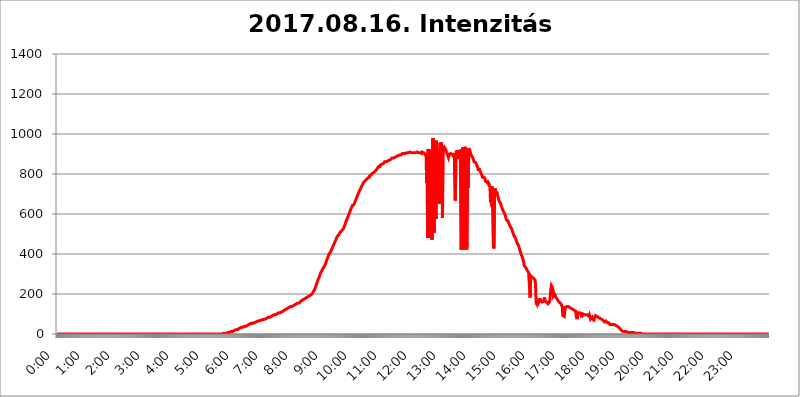
| Category | 2017.08.16. Intenzitás [W/m^2] |
|---|---|
| 0.0 | 0 |
| 0.0006944444444444445 | 0 |
| 0.001388888888888889 | 0 |
| 0.0020833333333333333 | 0 |
| 0.002777777777777778 | 0 |
| 0.003472222222222222 | 0 |
| 0.004166666666666667 | 0 |
| 0.004861111111111111 | 0 |
| 0.005555555555555556 | 0 |
| 0.0062499999999999995 | 0 |
| 0.006944444444444444 | 0 |
| 0.007638888888888889 | 0 |
| 0.008333333333333333 | 0 |
| 0.009027777777777779 | 0 |
| 0.009722222222222222 | 0 |
| 0.010416666666666666 | 0 |
| 0.011111111111111112 | 0 |
| 0.011805555555555555 | 0 |
| 0.012499999999999999 | 0 |
| 0.013194444444444444 | 0 |
| 0.013888888888888888 | 0 |
| 0.014583333333333332 | 0 |
| 0.015277777777777777 | 0 |
| 0.015972222222222224 | 0 |
| 0.016666666666666666 | 0 |
| 0.017361111111111112 | 0 |
| 0.018055555555555557 | 0 |
| 0.01875 | 0 |
| 0.019444444444444445 | 0 |
| 0.02013888888888889 | 0 |
| 0.020833333333333332 | 0 |
| 0.02152777777777778 | 0 |
| 0.022222222222222223 | 0 |
| 0.02291666666666667 | 0 |
| 0.02361111111111111 | 0 |
| 0.024305555555555556 | 0 |
| 0.024999999999999998 | 0 |
| 0.025694444444444447 | 0 |
| 0.02638888888888889 | 0 |
| 0.027083333333333334 | 0 |
| 0.027777777777777776 | 0 |
| 0.02847222222222222 | 0 |
| 0.029166666666666664 | 0 |
| 0.029861111111111113 | 0 |
| 0.030555555555555555 | 0 |
| 0.03125 | 0 |
| 0.03194444444444445 | 0 |
| 0.03263888888888889 | 0 |
| 0.03333333333333333 | 0 |
| 0.034027777777777775 | 0 |
| 0.034722222222222224 | 0 |
| 0.035416666666666666 | 0 |
| 0.036111111111111115 | 0 |
| 0.03680555555555556 | 0 |
| 0.0375 | 0 |
| 0.03819444444444444 | 0 |
| 0.03888888888888889 | 0 |
| 0.03958333333333333 | 0 |
| 0.04027777777777778 | 0 |
| 0.04097222222222222 | 0 |
| 0.041666666666666664 | 0 |
| 0.042361111111111106 | 0 |
| 0.04305555555555556 | 0 |
| 0.043750000000000004 | 0 |
| 0.044444444444444446 | 0 |
| 0.04513888888888889 | 0 |
| 0.04583333333333334 | 0 |
| 0.04652777777777778 | 0 |
| 0.04722222222222222 | 0 |
| 0.04791666666666666 | 0 |
| 0.04861111111111111 | 0 |
| 0.049305555555555554 | 0 |
| 0.049999999999999996 | 0 |
| 0.05069444444444445 | 0 |
| 0.051388888888888894 | 0 |
| 0.052083333333333336 | 0 |
| 0.05277777777777778 | 0 |
| 0.05347222222222222 | 0 |
| 0.05416666666666667 | 0 |
| 0.05486111111111111 | 0 |
| 0.05555555555555555 | 0 |
| 0.05625 | 0 |
| 0.05694444444444444 | 0 |
| 0.057638888888888885 | 0 |
| 0.05833333333333333 | 0 |
| 0.05902777777777778 | 0 |
| 0.059722222222222225 | 0 |
| 0.06041666666666667 | 0 |
| 0.061111111111111116 | 0 |
| 0.06180555555555556 | 0 |
| 0.0625 | 0 |
| 0.06319444444444444 | 0 |
| 0.06388888888888888 | 0 |
| 0.06458333333333334 | 0 |
| 0.06527777777777778 | 0 |
| 0.06597222222222222 | 0 |
| 0.06666666666666667 | 0 |
| 0.06736111111111111 | 0 |
| 0.06805555555555555 | 0 |
| 0.06874999999999999 | 0 |
| 0.06944444444444443 | 0 |
| 0.07013888888888889 | 0 |
| 0.07083333333333333 | 0 |
| 0.07152777777777779 | 0 |
| 0.07222222222222223 | 0 |
| 0.07291666666666667 | 0 |
| 0.07361111111111111 | 0 |
| 0.07430555555555556 | 0 |
| 0.075 | 0 |
| 0.07569444444444444 | 0 |
| 0.0763888888888889 | 0 |
| 0.07708333333333334 | 0 |
| 0.07777777777777778 | 0 |
| 0.07847222222222222 | 0 |
| 0.07916666666666666 | 0 |
| 0.0798611111111111 | 0 |
| 0.08055555555555556 | 0 |
| 0.08125 | 0 |
| 0.08194444444444444 | 0 |
| 0.08263888888888889 | 0 |
| 0.08333333333333333 | 0 |
| 0.08402777777777777 | 0 |
| 0.08472222222222221 | 0 |
| 0.08541666666666665 | 0 |
| 0.08611111111111112 | 0 |
| 0.08680555555555557 | 0 |
| 0.08750000000000001 | 0 |
| 0.08819444444444445 | 0 |
| 0.08888888888888889 | 0 |
| 0.08958333333333333 | 0 |
| 0.09027777777777778 | 0 |
| 0.09097222222222222 | 0 |
| 0.09166666666666667 | 0 |
| 0.09236111111111112 | 0 |
| 0.09305555555555556 | 0 |
| 0.09375 | 0 |
| 0.09444444444444444 | 0 |
| 0.09513888888888888 | 0 |
| 0.09583333333333333 | 0 |
| 0.09652777777777777 | 0 |
| 0.09722222222222222 | 0 |
| 0.09791666666666667 | 0 |
| 0.09861111111111111 | 0 |
| 0.09930555555555555 | 0 |
| 0.09999999999999999 | 0 |
| 0.10069444444444443 | 0 |
| 0.1013888888888889 | 0 |
| 0.10208333333333335 | 0 |
| 0.10277777777777779 | 0 |
| 0.10347222222222223 | 0 |
| 0.10416666666666667 | 0 |
| 0.10486111111111111 | 0 |
| 0.10555555555555556 | 0 |
| 0.10625 | 0 |
| 0.10694444444444444 | 0 |
| 0.1076388888888889 | 0 |
| 0.10833333333333334 | 0 |
| 0.10902777777777778 | 0 |
| 0.10972222222222222 | 0 |
| 0.1111111111111111 | 0 |
| 0.11180555555555556 | 0 |
| 0.11180555555555556 | 0 |
| 0.1125 | 0 |
| 0.11319444444444444 | 0 |
| 0.11388888888888889 | 0 |
| 0.11458333333333333 | 0 |
| 0.11527777777777777 | 0 |
| 0.11597222222222221 | 0 |
| 0.11666666666666665 | 0 |
| 0.1173611111111111 | 0 |
| 0.11805555555555557 | 0 |
| 0.11944444444444445 | 0 |
| 0.12013888888888889 | 0 |
| 0.12083333333333333 | 0 |
| 0.12152777777777778 | 0 |
| 0.12222222222222223 | 0 |
| 0.12291666666666667 | 0 |
| 0.12291666666666667 | 0 |
| 0.12361111111111112 | 0 |
| 0.12430555555555556 | 0 |
| 0.125 | 0 |
| 0.12569444444444444 | 0 |
| 0.12638888888888888 | 0 |
| 0.12708333333333333 | 0 |
| 0.16875 | 0 |
| 0.12847222222222224 | 0 |
| 0.12916666666666668 | 0 |
| 0.12986111111111112 | 0 |
| 0.13055555555555556 | 0 |
| 0.13125 | 0 |
| 0.13194444444444445 | 0 |
| 0.1326388888888889 | 0 |
| 0.13333333333333333 | 0 |
| 0.13402777777777777 | 0 |
| 0.13402777777777777 | 0 |
| 0.13472222222222222 | 0 |
| 0.13541666666666666 | 0 |
| 0.1361111111111111 | 0 |
| 0.13749999999999998 | 0 |
| 0.13819444444444443 | 0 |
| 0.1388888888888889 | 0 |
| 0.13958333333333334 | 0 |
| 0.14027777777777778 | 0 |
| 0.14097222222222222 | 0 |
| 0.14166666666666666 | 0 |
| 0.1423611111111111 | 0 |
| 0.14305555555555557 | 0 |
| 0.14375000000000002 | 0 |
| 0.14444444444444446 | 0 |
| 0.1451388888888889 | 0 |
| 0.1451388888888889 | 0 |
| 0.14652777777777778 | 0 |
| 0.14722222222222223 | 0 |
| 0.14791666666666667 | 0 |
| 0.1486111111111111 | 0 |
| 0.14930555555555555 | 0 |
| 0.15 | 0 |
| 0.15069444444444444 | 0 |
| 0.15138888888888888 | 0 |
| 0.15208333333333332 | 0 |
| 0.15277777777777776 | 0 |
| 0.15347222222222223 | 0 |
| 0.15416666666666667 | 0 |
| 0.15486111111111112 | 0 |
| 0.15555555555555556 | 0 |
| 0.15625 | 0 |
| 0.15694444444444444 | 0 |
| 0.15763888888888888 | 0 |
| 0.15833333333333333 | 0 |
| 0.15902777777777777 | 0 |
| 0.15972222222222224 | 0 |
| 0.16041666666666668 | 0 |
| 0.16111111111111112 | 0 |
| 0.16180555555555556 | 0 |
| 0.1625 | 0 |
| 0.16319444444444445 | 0 |
| 0.1638888888888889 | 0 |
| 0.16458333333333333 | 0 |
| 0.16527777777777777 | 0 |
| 0.16597222222222222 | 0 |
| 0.16666666666666666 | 0 |
| 0.1673611111111111 | 0 |
| 0.16805555555555554 | 0 |
| 0.16874999999999998 | 0 |
| 0.16944444444444443 | 0 |
| 0.17013888888888887 | 0 |
| 0.1708333333333333 | 0 |
| 0.17152777777777775 | 0 |
| 0.17222222222222225 | 0 |
| 0.1729166666666667 | 0 |
| 0.17361111111111113 | 0 |
| 0.17430555555555557 | 0 |
| 0.17500000000000002 | 0 |
| 0.17569444444444446 | 0 |
| 0.1763888888888889 | 0 |
| 0.17708333333333334 | 0 |
| 0.17777777777777778 | 0 |
| 0.17847222222222223 | 0 |
| 0.17916666666666667 | 0 |
| 0.1798611111111111 | 0 |
| 0.18055555555555555 | 0 |
| 0.18125 | 0 |
| 0.18194444444444444 | 0 |
| 0.1826388888888889 | 0 |
| 0.18333333333333335 | 0 |
| 0.1840277777777778 | 0 |
| 0.18472222222222223 | 0 |
| 0.18541666666666667 | 0 |
| 0.18611111111111112 | 0 |
| 0.18680555555555556 | 0 |
| 0.1875 | 0 |
| 0.18819444444444444 | 0 |
| 0.18888888888888888 | 0 |
| 0.18958333333333333 | 0 |
| 0.19027777777777777 | 0 |
| 0.1909722222222222 | 0 |
| 0.19166666666666665 | 0 |
| 0.19236111111111112 | 0 |
| 0.19305555555555554 | 0 |
| 0.19375 | 0 |
| 0.19444444444444445 | 0 |
| 0.1951388888888889 | 0 |
| 0.19583333333333333 | 0 |
| 0.19652777777777777 | 0 |
| 0.19722222222222222 | 0 |
| 0.19791666666666666 | 0 |
| 0.1986111111111111 | 0 |
| 0.19930555555555554 | 0 |
| 0.19999999999999998 | 0 |
| 0.20069444444444443 | 0 |
| 0.20138888888888887 | 0 |
| 0.2020833333333333 | 0 |
| 0.2027777777777778 | 0 |
| 0.2034722222222222 | 0 |
| 0.2041666666666667 | 0 |
| 0.20486111111111113 | 0 |
| 0.20555555555555557 | 0 |
| 0.20625000000000002 | 0 |
| 0.20694444444444446 | 0 |
| 0.2076388888888889 | 0 |
| 0.20833333333333334 | 0 |
| 0.20902777777777778 | 0 |
| 0.20972222222222223 | 0 |
| 0.21041666666666667 | 0 |
| 0.2111111111111111 | 0 |
| 0.21180555555555555 | 0 |
| 0.2125 | 0 |
| 0.21319444444444444 | 0 |
| 0.2138888888888889 | 0 |
| 0.21458333333333335 | 0 |
| 0.2152777777777778 | 0 |
| 0.21597222222222223 | 0 |
| 0.21666666666666667 | 0 |
| 0.21736111111111112 | 0 |
| 0.21805555555555556 | 0 |
| 0.21875 | 0 |
| 0.21944444444444444 | 0 |
| 0.22013888888888888 | 0 |
| 0.22083333333333333 | 0 |
| 0.22152777777777777 | 0 |
| 0.2222222222222222 | 0 |
| 0.22291666666666665 | 0 |
| 0.2236111111111111 | 0 |
| 0.22430555555555556 | 0 |
| 0.225 | 0 |
| 0.22569444444444445 | 0 |
| 0.2263888888888889 | 0 |
| 0.22708333333333333 | 0 |
| 0.22777777777777777 | 0 |
| 0.22847222222222222 | 0 |
| 0.22916666666666666 | 0 |
| 0.2298611111111111 | 0 |
| 0.23055555555555554 | 0 |
| 0.23124999999999998 | 0 |
| 0.23194444444444443 | 0 |
| 0.23263888888888887 | 0 |
| 0.2333333333333333 | 3.525 |
| 0.2340277777777778 | 3.525 |
| 0.2347222222222222 | 3.525 |
| 0.2354166666666667 | 3.525 |
| 0.23611111111111113 | 3.525 |
| 0.23680555555555557 | 3.525 |
| 0.23750000000000002 | 3.525 |
| 0.23819444444444446 | 3.525 |
| 0.2388888888888889 | 3.525 |
| 0.23958333333333334 | 7.887 |
| 0.24027777777777778 | 7.887 |
| 0.24097222222222223 | 7.887 |
| 0.24166666666666667 | 7.887 |
| 0.2423611111111111 | 12.257 |
| 0.24305555555555555 | 12.257 |
| 0.24375 | 12.257 |
| 0.24444444444444446 | 12.257 |
| 0.24513888888888888 | 12.257 |
| 0.24583333333333335 | 12.257 |
| 0.2465277777777778 | 16.636 |
| 0.24722222222222223 | 16.636 |
| 0.24791666666666667 | 16.636 |
| 0.24861111111111112 | 16.636 |
| 0.24930555555555556 | 21.024 |
| 0.25 | 21.024 |
| 0.25069444444444444 | 21.024 |
| 0.2513888888888889 | 21.024 |
| 0.2520833333333333 | 21.024 |
| 0.25277777777777777 | 25.419 |
| 0.2534722222222222 | 25.419 |
| 0.25416666666666665 | 25.419 |
| 0.2548611111111111 | 25.419 |
| 0.2555555555555556 | 29.823 |
| 0.25625000000000003 | 29.823 |
| 0.2569444444444445 | 29.823 |
| 0.2576388888888889 | 29.823 |
| 0.25833333333333336 | 34.234 |
| 0.2590277777777778 | 34.234 |
| 0.25972222222222224 | 34.234 |
| 0.2604166666666667 | 34.234 |
| 0.2611111111111111 | 38.653 |
| 0.26180555555555557 | 38.653 |
| 0.2625 | 38.653 |
| 0.26319444444444445 | 38.653 |
| 0.2638888888888889 | 38.653 |
| 0.26458333333333334 | 38.653 |
| 0.2652777777777778 | 43.079 |
| 0.2659722222222222 | 43.079 |
| 0.26666666666666666 | 43.079 |
| 0.2673611111111111 | 43.079 |
| 0.26805555555555555 | 47.511 |
| 0.26875 | 47.511 |
| 0.26944444444444443 | 47.511 |
| 0.2701388888888889 | 47.511 |
| 0.2708333333333333 | 51.951 |
| 0.27152777777777776 | 51.951 |
| 0.2722222222222222 | 51.951 |
| 0.27291666666666664 | 51.951 |
| 0.2736111111111111 | 51.951 |
| 0.2743055555555555 | 56.398 |
| 0.27499999999999997 | 56.398 |
| 0.27569444444444446 | 56.398 |
| 0.27638888888888885 | 56.398 |
| 0.27708333333333335 | 56.398 |
| 0.2777777777777778 | 56.398 |
| 0.27847222222222223 | 60.85 |
| 0.2791666666666667 | 60.85 |
| 0.2798611111111111 | 60.85 |
| 0.28055555555555556 | 60.85 |
| 0.28125 | 65.31 |
| 0.28194444444444444 | 65.31 |
| 0.2826388888888889 | 65.31 |
| 0.2833333333333333 | 65.31 |
| 0.28402777777777777 | 65.31 |
| 0.2847222222222222 | 65.31 |
| 0.28541666666666665 | 69.775 |
| 0.28611111111111115 | 69.775 |
| 0.28680555555555554 | 69.775 |
| 0.28750000000000003 | 69.775 |
| 0.2881944444444445 | 69.775 |
| 0.2888888888888889 | 74.246 |
| 0.28958333333333336 | 74.246 |
| 0.2902777777777778 | 74.246 |
| 0.29097222222222224 | 74.246 |
| 0.2916666666666667 | 74.246 |
| 0.2923611111111111 | 78.722 |
| 0.29305555555555557 | 78.722 |
| 0.29375 | 78.722 |
| 0.29444444444444445 | 78.722 |
| 0.2951388888888889 | 83.205 |
| 0.29583333333333334 | 83.205 |
| 0.2965277777777778 | 83.205 |
| 0.2972222222222222 | 83.205 |
| 0.29791666666666666 | 83.205 |
| 0.2986111111111111 | 87.692 |
| 0.29930555555555555 | 87.692 |
| 0.3 | 87.692 |
| 0.30069444444444443 | 87.692 |
| 0.3013888888888889 | 92.184 |
| 0.3020833333333333 | 92.184 |
| 0.30277777777777776 | 92.184 |
| 0.3034722222222222 | 92.184 |
| 0.30416666666666664 | 96.682 |
| 0.3048611111111111 | 96.682 |
| 0.3055555555555555 | 96.682 |
| 0.30624999999999997 | 96.682 |
| 0.3069444444444444 | 101.184 |
| 0.3076388888888889 | 101.184 |
| 0.30833333333333335 | 101.184 |
| 0.3090277777777778 | 101.184 |
| 0.30972222222222223 | 105.69 |
| 0.3104166666666667 | 105.69 |
| 0.3111111111111111 | 105.69 |
| 0.31180555555555556 | 105.69 |
| 0.3125 | 105.69 |
| 0.31319444444444444 | 110.201 |
| 0.3138888888888889 | 110.201 |
| 0.3145833333333333 | 110.201 |
| 0.31527777777777777 | 110.201 |
| 0.3159722222222222 | 114.716 |
| 0.31666666666666665 | 114.716 |
| 0.31736111111111115 | 114.716 |
| 0.31805555555555554 | 119.235 |
| 0.31875000000000003 | 119.235 |
| 0.3194444444444445 | 119.235 |
| 0.3201388888888889 | 119.235 |
| 0.32083333333333336 | 123.758 |
| 0.3215277777777778 | 123.758 |
| 0.32222222222222224 | 123.758 |
| 0.3229166666666667 | 128.284 |
| 0.3236111111111111 | 128.284 |
| 0.32430555555555557 | 128.284 |
| 0.325 | 132.814 |
| 0.32569444444444445 | 132.814 |
| 0.3263888888888889 | 132.814 |
| 0.32708333333333334 | 137.347 |
| 0.3277777777777778 | 137.347 |
| 0.3284722222222222 | 137.347 |
| 0.32916666666666666 | 137.347 |
| 0.3298611111111111 | 137.347 |
| 0.33055555555555555 | 141.884 |
| 0.33125 | 141.884 |
| 0.33194444444444443 | 146.423 |
| 0.3326388888888889 | 146.423 |
| 0.3333333333333333 | 146.423 |
| 0.3340277777777778 | 146.423 |
| 0.3347222222222222 | 150.964 |
| 0.3354166666666667 | 150.964 |
| 0.3361111111111111 | 150.964 |
| 0.3368055555555556 | 150.964 |
| 0.33749999999999997 | 155.509 |
| 0.33819444444444446 | 155.509 |
| 0.33888888888888885 | 155.509 |
| 0.33958333333333335 | 155.509 |
| 0.34027777777777773 | 160.056 |
| 0.34097222222222223 | 160.056 |
| 0.3416666666666666 | 164.605 |
| 0.3423611111111111 | 164.605 |
| 0.3430555555555555 | 164.605 |
| 0.34375 | 169.156 |
| 0.3444444444444445 | 169.156 |
| 0.3451388888888889 | 169.156 |
| 0.3458333333333334 | 173.709 |
| 0.34652777777777777 | 173.709 |
| 0.34722222222222227 | 173.709 |
| 0.34791666666666665 | 178.264 |
| 0.34861111111111115 | 178.264 |
| 0.34930555555555554 | 182.82 |
| 0.35000000000000003 | 182.82 |
| 0.3506944444444444 | 182.82 |
| 0.3513888888888889 | 182.82 |
| 0.3520833333333333 | 187.378 |
| 0.3527777777777778 | 187.378 |
| 0.3534722222222222 | 191.937 |
| 0.3541666666666667 | 191.937 |
| 0.3548611111111111 | 191.937 |
| 0.35555555555555557 | 191.937 |
| 0.35625 | 196.497 |
| 0.35694444444444445 | 196.497 |
| 0.3576388888888889 | 201.058 |
| 0.35833333333333334 | 205.62 |
| 0.3590277777777778 | 210.182 |
| 0.3597222222222222 | 214.746 |
| 0.36041666666666666 | 219.309 |
| 0.3611111111111111 | 223.873 |
| 0.36180555555555555 | 228.436 |
| 0.3625 | 237.564 |
| 0.36319444444444443 | 242.127 |
| 0.3638888888888889 | 251.251 |
| 0.3645833333333333 | 260.373 |
| 0.3652777777777778 | 264.932 |
| 0.3659722222222222 | 274.047 |
| 0.3666666666666667 | 278.603 |
| 0.3673611111111111 | 283.156 |
| 0.3680555555555556 | 292.259 |
| 0.36874999999999997 | 296.808 |
| 0.36944444444444446 | 305.898 |
| 0.37013888888888885 | 310.44 |
| 0.37083333333333335 | 314.98 |
| 0.37152777777777773 | 319.517 |
| 0.37222222222222223 | 324.052 |
| 0.3729166666666666 | 328.584 |
| 0.3736111111111111 | 333.113 |
| 0.3743055555555555 | 337.639 |
| 0.375 | 342.162 |
| 0.3756944444444445 | 346.682 |
| 0.3763888888888889 | 351.198 |
| 0.3770833333333334 | 360.221 |
| 0.37777777777777777 | 364.728 |
| 0.37847222222222227 | 373.729 |
| 0.37916666666666665 | 378.224 |
| 0.37986111111111115 | 387.202 |
| 0.38055555555555554 | 391.685 |
| 0.38125000000000003 | 400.638 |
| 0.3819444444444444 | 400.638 |
| 0.3826388888888889 | 405.108 |
| 0.3833333333333333 | 409.574 |
| 0.3840277777777778 | 414.035 |
| 0.3847222222222222 | 422.943 |
| 0.3854166666666667 | 427.39 |
| 0.3861111111111111 | 431.833 |
| 0.38680555555555557 | 440.702 |
| 0.3875 | 445.129 |
| 0.38819444444444445 | 449.551 |
| 0.3888888888888889 | 453.968 |
| 0.38958333333333334 | 462.786 |
| 0.3902777777777778 | 467.187 |
| 0.3909722222222222 | 471.582 |
| 0.39166666666666666 | 480.356 |
| 0.3923611111111111 | 484.735 |
| 0.39305555555555555 | 489.108 |
| 0.39375 | 489.108 |
| 0.39444444444444443 | 493.475 |
| 0.3951388888888889 | 497.836 |
| 0.3958333333333333 | 502.192 |
| 0.3965277777777778 | 506.542 |
| 0.3972222222222222 | 506.542 |
| 0.3979166666666667 | 510.885 |
| 0.3986111111111111 | 515.223 |
| 0.3993055555555556 | 519.555 |
| 0.39999999999999997 | 519.555 |
| 0.40069444444444446 | 523.88 |
| 0.40138888888888885 | 528.2 |
| 0.40208333333333335 | 532.513 |
| 0.40277777777777773 | 536.82 |
| 0.40347222222222223 | 545.416 |
| 0.4041666666666666 | 553.986 |
| 0.4048611111111111 | 558.261 |
| 0.4055555555555555 | 566.793 |
| 0.40625 | 571.049 |
| 0.4069444444444445 | 579.542 |
| 0.4076388888888889 | 583.779 |
| 0.4083333333333334 | 592.233 |
| 0.40902777777777777 | 596.45 |
| 0.40972222222222227 | 604.864 |
| 0.41041666666666665 | 609.062 |
| 0.41111111111111115 | 617.436 |
| 0.41180555555555554 | 625.784 |
| 0.41250000000000003 | 629.948 |
| 0.4131944444444444 | 634.105 |
| 0.4138888888888889 | 642.4 |
| 0.4145833333333333 | 642.4 |
| 0.4152777777777778 | 646.537 |
| 0.4159722222222222 | 646.537 |
| 0.4166666666666667 | 650.667 |
| 0.4173611111111111 | 658.909 |
| 0.41805555555555557 | 663.019 |
| 0.41875 | 671.22 |
| 0.41944444444444445 | 675.311 |
| 0.4201388888888889 | 683.473 |
| 0.42083333333333334 | 687.544 |
| 0.4215277777777778 | 695.666 |
| 0.4222222222222222 | 699.717 |
| 0.42291666666666666 | 707.8 |
| 0.4236111111111111 | 711.832 |
| 0.42430555555555555 | 719.877 |
| 0.425 | 723.889 |
| 0.42569444444444443 | 727.896 |
| 0.4263888888888889 | 735.89 |
| 0.4270833333333333 | 739.877 |
| 0.4277777777777778 | 743.859 |
| 0.4284722222222222 | 747.834 |
| 0.4291666666666667 | 755.766 |
| 0.4298611111111111 | 755.766 |
| 0.4305555555555556 | 759.723 |
| 0.43124999999999997 | 763.674 |
| 0.43194444444444446 | 767.62 |
| 0.43263888888888885 | 767.62 |
| 0.43333333333333335 | 771.559 |
| 0.43402777777777773 | 775.492 |
| 0.43472222222222223 | 775.492 |
| 0.4354166666666666 | 779.42 |
| 0.4361111111111111 | 783.342 |
| 0.4368055555555555 | 783.342 |
| 0.4375 | 783.342 |
| 0.4381944444444445 | 791.169 |
| 0.4388888888888889 | 791.169 |
| 0.4395833333333334 | 791.169 |
| 0.44027777777777777 | 795.074 |
| 0.44097222222222227 | 798.974 |
| 0.44166666666666665 | 802.868 |
| 0.44236111111111115 | 802.868 |
| 0.44305555555555554 | 802.868 |
| 0.44375000000000003 | 806.757 |
| 0.4444444444444444 | 810.641 |
| 0.4451388888888889 | 810.641 |
| 0.4458333333333333 | 814.519 |
| 0.4465277777777778 | 814.519 |
| 0.4472222222222222 | 818.392 |
| 0.4479166666666667 | 822.26 |
| 0.4486111111111111 | 822.26 |
| 0.44930555555555557 | 829.981 |
| 0.45 | 829.981 |
| 0.45069444444444445 | 837.682 |
| 0.4513888888888889 | 837.682 |
| 0.45208333333333334 | 837.682 |
| 0.4527777777777778 | 837.682 |
| 0.4534722222222222 | 845.365 |
| 0.45416666666666666 | 845.365 |
| 0.4548611111111111 | 849.199 |
| 0.45555555555555555 | 849.199 |
| 0.45625 | 853.029 |
| 0.45694444444444443 | 849.199 |
| 0.4576388888888889 | 853.029 |
| 0.4583333333333333 | 856.855 |
| 0.4590277777777778 | 860.676 |
| 0.4597222222222222 | 860.676 |
| 0.4604166666666667 | 860.676 |
| 0.4611111111111111 | 860.676 |
| 0.4618055555555556 | 860.676 |
| 0.46249999999999997 | 860.676 |
| 0.46319444444444446 | 864.493 |
| 0.46388888888888885 | 868.305 |
| 0.46458333333333335 | 864.493 |
| 0.46527777777777773 | 868.305 |
| 0.46597222222222223 | 868.305 |
| 0.4666666666666666 | 868.305 |
| 0.4673611111111111 | 872.114 |
| 0.4680555555555555 | 868.305 |
| 0.46875 | 872.114 |
| 0.4694444444444445 | 879.719 |
| 0.4701388888888889 | 879.719 |
| 0.4708333333333334 | 879.719 |
| 0.47152777777777777 | 879.719 |
| 0.47222222222222227 | 883.516 |
| 0.47291666666666665 | 883.516 |
| 0.47361111111111115 | 883.516 |
| 0.47430555555555554 | 883.516 |
| 0.47500000000000003 | 887.309 |
| 0.4756944444444444 | 887.309 |
| 0.4763888888888889 | 887.309 |
| 0.4770833333333333 | 891.099 |
| 0.4777777777777778 | 891.099 |
| 0.4784722222222222 | 891.099 |
| 0.4791666666666667 | 894.885 |
| 0.4798611111111111 | 894.885 |
| 0.48055555555555557 | 894.885 |
| 0.48125 | 894.885 |
| 0.48194444444444445 | 894.885 |
| 0.4826388888888889 | 894.885 |
| 0.48333333333333334 | 898.668 |
| 0.4840277777777778 | 902.447 |
| 0.4847222222222222 | 902.447 |
| 0.48541666666666666 | 902.447 |
| 0.4861111111111111 | 902.447 |
| 0.48680555555555555 | 902.447 |
| 0.4875 | 902.447 |
| 0.48819444444444443 | 902.447 |
| 0.4888888888888889 | 906.223 |
| 0.4895833333333333 | 906.223 |
| 0.4902777777777778 | 906.223 |
| 0.4909722222222222 | 906.223 |
| 0.4916666666666667 | 906.223 |
| 0.4923611111111111 | 906.223 |
| 0.4930555555555556 | 906.223 |
| 0.49374999999999997 | 906.223 |
| 0.49444444444444446 | 909.996 |
| 0.49513888888888885 | 909.996 |
| 0.49583333333333335 | 906.223 |
| 0.49652777777777773 | 906.223 |
| 0.49722222222222223 | 909.996 |
| 0.4979166666666666 | 906.223 |
| 0.4986111111111111 | 906.223 |
| 0.4993055555555555 | 909.996 |
| 0.5 | 906.223 |
| 0.5006944444444444 | 906.223 |
| 0.5013888888888889 | 909.996 |
| 0.5020833333333333 | 909.996 |
| 0.5027777777777778 | 906.223 |
| 0.5034722222222222 | 909.996 |
| 0.5041666666666667 | 909.996 |
| 0.5048611111111111 | 909.996 |
| 0.5055555555555555 | 909.996 |
| 0.50625 | 909.996 |
| 0.5069444444444444 | 906.223 |
| 0.5076388888888889 | 909.996 |
| 0.5083333333333333 | 909.996 |
| 0.5090277777777777 | 906.223 |
| 0.5097222222222222 | 906.223 |
| 0.5104166666666666 | 906.223 |
| 0.5111111111111112 | 902.447 |
| 0.5118055555555555 | 909.996 |
| 0.5125000000000001 | 909.996 |
| 0.5131944444444444 | 909.996 |
| 0.513888888888889 | 906.223 |
| 0.5145833333333333 | 902.447 |
| 0.5152777777777778 | 902.447 |
| 0.5159722222222222 | 898.668 |
| 0.5166666666666667 | 894.885 |
| 0.517361111111111 | 887.309 |
| 0.5180555555555556 | 755.766 |
| 0.5187499999999999 | 902.447 |
| 0.5194444444444445 | 480.356 |
| 0.5201388888888888 | 925.06 |
| 0.5208333333333334 | 913.766 |
| 0.5215277777777778 | 894.885 |
| 0.5222222222222223 | 894.885 |
| 0.5229166666666667 | 921.298 |
| 0.5236111111111111 | 480.356 |
| 0.5243055555555556 | 502.192 |
| 0.525 | 837.682 |
| 0.5256944444444445 | 471.582 |
| 0.5263888888888889 | 977.508 |
| 0.5270833333333333 | 958.814 |
| 0.5277777777777778 | 977.508 |
| 0.5284722222222222 | 506.542 |
| 0.5291666666666667 | 791.169 |
| 0.5298611111111111 | 872.114 |
| 0.5305555555555556 | 600.661 |
| 0.53125 | 575.299 |
| 0.5319444444444444 | 966.295 |
| 0.5326388888888889 | 898.668 |
| 0.5333333333333333 | 711.832 |
| 0.5340277777777778 | 650.667 |
| 0.5347222222222222 | 909.996 |
| 0.5354166666666667 | 650.667 |
| 0.5361111111111111 | 658.909 |
| 0.5368055555555555 | 955.071 |
| 0.5375 | 947.58 |
| 0.5381944444444444 | 958.814 |
| 0.5388888888888889 | 955.071 |
| 0.5395833333333333 | 936.33 |
| 0.5402777777777777 | 579.542 |
| 0.5409722222222222 | 925.06 |
| 0.5416666666666666 | 936.33 |
| 0.5423611111111112 | 925.06 |
| 0.5430555555555555 | 932.576 |
| 0.5437500000000001 | 928.819 |
| 0.5444444444444444 | 925.06 |
| 0.545138888888889 | 917.534 |
| 0.5458333333333333 | 913.766 |
| 0.5465277777777778 | 906.223 |
| 0.5472222222222222 | 898.668 |
| 0.5479166666666667 | 898.668 |
| 0.548611111111111 | 883.516 |
| 0.5493055555555556 | 894.885 |
| 0.5499999999999999 | 898.668 |
| 0.5506944444444445 | 894.885 |
| 0.5513888888888888 | 902.447 |
| 0.5520833333333334 | 898.668 |
| 0.5527777777777778 | 902.447 |
| 0.5534722222222223 | 898.668 |
| 0.5541666666666667 | 898.668 |
| 0.5548611111111111 | 902.447 |
| 0.5555555555555556 | 898.668 |
| 0.55625 | 883.516 |
| 0.5569444444444445 | 894.885 |
| 0.5576388888888889 | 894.885 |
| 0.5583333333333333 | 667.123 |
| 0.5590277777777778 | 841.526 |
| 0.5597222222222222 | 917.534 |
| 0.5604166666666667 | 909.996 |
| 0.5611111111111111 | 917.534 |
| 0.5618055555555556 | 891.099 |
| 0.5625 | 875.918 |
| 0.5631944444444444 | 883.516 |
| 0.5638888888888889 | 913.766 |
| 0.5645833333333333 | 898.668 |
| 0.5652777777777778 | 921.298 |
| 0.5659722222222222 | 917.534 |
| 0.5666666666666667 | 422.943 |
| 0.5673611111111111 | 625.784 |
| 0.5680555555555555 | 925.06 |
| 0.56875 | 932.576 |
| 0.5694444444444444 | 536.82 |
| 0.5701388888888889 | 629.948 |
| 0.5708333333333333 | 422.943 |
| 0.5715277777777777 | 475.972 |
| 0.5722222222222222 | 936.33 |
| 0.5729166666666666 | 638.256 |
| 0.5736111111111112 | 445.129 |
| 0.5743055555555555 | 422.943 |
| 0.5750000000000001 | 453.968 |
| 0.5756944444444444 | 902.447 |
| 0.576388888888889 | 731.896 |
| 0.5770833333333333 | 928.819 |
| 0.5777777777777778 | 928.819 |
| 0.5784722222222222 | 928.819 |
| 0.5791666666666667 | 909.996 |
| 0.579861111111111 | 902.447 |
| 0.5805555555555556 | 894.885 |
| 0.5812499999999999 | 891.099 |
| 0.5819444444444445 | 887.309 |
| 0.5826388888888888 | 883.516 |
| 0.5833333333333334 | 875.918 |
| 0.5840277777777778 | 872.114 |
| 0.5847222222222223 | 860.676 |
| 0.5854166666666667 | 864.493 |
| 0.5861111111111111 | 856.855 |
| 0.5868055555555556 | 856.855 |
| 0.5875 | 853.029 |
| 0.5881944444444445 | 845.365 |
| 0.5888888888888889 | 841.526 |
| 0.5895833333333333 | 833.834 |
| 0.5902777777777778 | 822.26 |
| 0.5909722222222222 | 818.392 |
| 0.5916666666666667 | 822.26 |
| 0.5923611111111111 | 822.26 |
| 0.5930555555555556 | 814.519 |
| 0.59375 | 810.641 |
| 0.5944444444444444 | 802.868 |
| 0.5951388888888889 | 802.868 |
| 0.5958333333333333 | 791.169 |
| 0.5965277777777778 | 783.342 |
| 0.5972222222222222 | 779.42 |
| 0.5979166666666667 | 783.342 |
| 0.5986111111111111 | 783.342 |
| 0.5993055555555555 | 779.42 |
| 0.6 | 775.492 |
| 0.6006944444444444 | 763.674 |
| 0.6013888888888889 | 763.674 |
| 0.6020833333333333 | 763.674 |
| 0.6027777777777777 | 759.723 |
| 0.6034722222222222 | 767.62 |
| 0.6041666666666666 | 751.803 |
| 0.6048611111111112 | 759.723 |
| 0.6055555555555555 | 743.859 |
| 0.6062500000000001 | 743.859 |
| 0.6069444444444444 | 735.89 |
| 0.607638888888889 | 658.909 |
| 0.6083333333333333 | 735.89 |
| 0.6090277777777778 | 739.877 |
| 0.6097222222222222 | 638.256 |
| 0.6104166666666667 | 735.89 |
| 0.611111111111111 | 739.877 |
| 0.6118055555555556 | 440.702 |
| 0.6124999999999999 | 427.39 |
| 0.6131944444444445 | 671.22 |
| 0.6138888888888888 | 727.896 |
| 0.6145833333333334 | 719.877 |
| 0.6152777777777778 | 691.608 |
| 0.6159722222222223 | 711.832 |
| 0.6166666666666667 | 711.832 |
| 0.6173611111111111 | 695.666 |
| 0.6180555555555556 | 687.544 |
| 0.61875 | 675.311 |
| 0.6194444444444445 | 667.123 |
| 0.6201388888888889 | 663.019 |
| 0.6208333333333333 | 663.019 |
| 0.6215277777777778 | 654.791 |
| 0.6222222222222222 | 646.537 |
| 0.6229166666666667 | 638.256 |
| 0.6236111111111111 | 634.105 |
| 0.6243055555555556 | 625.784 |
| 0.625 | 621.613 |
| 0.6256944444444444 | 613.252 |
| 0.6263888888888889 | 609.062 |
| 0.6270833333333333 | 604.864 |
| 0.6277777777777778 | 600.661 |
| 0.6284722222222222 | 592.233 |
| 0.6291666666666667 | 588.009 |
| 0.6298611111111111 | 571.049 |
| 0.6305555555555555 | 575.299 |
| 0.63125 | 571.049 |
| 0.6319444444444444 | 566.793 |
| 0.6326388888888889 | 558.261 |
| 0.6333333333333333 | 553.986 |
| 0.6340277777777777 | 549.704 |
| 0.6347222222222222 | 541.121 |
| 0.6354166666666666 | 541.121 |
| 0.6361111111111112 | 532.513 |
| 0.6368055555555555 | 528.2 |
| 0.6375000000000001 | 523.88 |
| 0.6381944444444444 | 515.223 |
| 0.638888888888889 | 510.885 |
| 0.6395833333333333 | 502.192 |
| 0.6402777777777778 | 493.475 |
| 0.6409722222222222 | 489.108 |
| 0.6416666666666667 | 484.735 |
| 0.642361111111111 | 480.356 |
| 0.6430555555555556 | 475.972 |
| 0.6437499999999999 | 467.187 |
| 0.6444444444444445 | 462.786 |
| 0.6451388888888888 | 453.968 |
| 0.6458333333333334 | 449.551 |
| 0.6465277777777778 | 445.129 |
| 0.6472222222222223 | 440.702 |
| 0.6479166666666667 | 431.833 |
| 0.6486111111111111 | 422.943 |
| 0.6493055555555556 | 414.035 |
| 0.65 | 405.108 |
| 0.6506944444444445 | 396.164 |
| 0.6513888888888889 | 391.685 |
| 0.6520833333333333 | 387.202 |
| 0.6527777777777778 | 378.224 |
| 0.6534722222222222 | 369.23 |
| 0.6541666666666667 | 360.221 |
| 0.6548611111111111 | 342.162 |
| 0.6555555555555556 | 342.162 |
| 0.65625 | 337.639 |
| 0.6569444444444444 | 333.113 |
| 0.6576388888888889 | 328.584 |
| 0.6583333333333333 | 324.052 |
| 0.6590277777777778 | 319.517 |
| 0.6597222222222222 | 314.98 |
| 0.6604166666666667 | 310.44 |
| 0.6611111111111111 | 305.898 |
| 0.6618055555555555 | 305.898 |
| 0.6625 | 301.354 |
| 0.6631944444444444 | 182.82 |
| 0.6638888888888889 | 292.259 |
| 0.6645833333333333 | 287.709 |
| 0.6652777777777777 | 287.709 |
| 0.6659722222222222 | 283.156 |
| 0.6666666666666666 | 283.156 |
| 0.6673611111111111 | 278.603 |
| 0.6680555555555556 | 278.603 |
| 0.6687500000000001 | 278.603 |
| 0.6694444444444444 | 274.047 |
| 0.6701388888888888 | 269.49 |
| 0.6708333333333334 | 242.127 |
| 0.6715277777777778 | 160.056 |
| 0.6722222222222222 | 146.423 |
| 0.6729166666666666 | 155.509 |
| 0.6736111111111112 | 146.423 |
| 0.6743055555555556 | 146.423 |
| 0.6749999999999999 | 155.509 |
| 0.6756944444444444 | 155.509 |
| 0.6763888888888889 | 160.056 |
| 0.6770833333333334 | 178.264 |
| 0.6777777777777777 | 164.605 |
| 0.6784722222222223 | 164.605 |
| 0.6791666666666667 | 160.056 |
| 0.6798611111111111 | 160.056 |
| 0.6805555555555555 | 164.605 |
| 0.68125 | 164.605 |
| 0.6819444444444445 | 164.605 |
| 0.6826388888888889 | 169.156 |
| 0.6833333333333332 | 182.82 |
| 0.6840277777777778 | 164.605 |
| 0.6847222222222222 | 160.056 |
| 0.6854166666666667 | 160.056 |
| 0.686111111111111 | 160.056 |
| 0.6868055555555556 | 155.509 |
| 0.6875 | 155.509 |
| 0.6881944444444444 | 150.964 |
| 0.688888888888889 | 150.964 |
| 0.6895833333333333 | 155.509 |
| 0.6902777777777778 | 160.056 |
| 0.6909722222222222 | 169.156 |
| 0.6916666666666668 | 205.62 |
| 0.6923611111111111 | 201.058 |
| 0.6930555555555555 | 242.127 |
| 0.69375 | 237.564 |
| 0.6944444444444445 | 233 |
| 0.6951388888888889 | 223.873 |
| 0.6958333333333333 | 191.937 |
| 0.6965277777777777 | 187.378 |
| 0.6972222222222223 | 201.058 |
| 0.6979166666666666 | 196.497 |
| 0.6986111111111111 | 191.937 |
| 0.6993055555555556 | 182.82 |
| 0.7000000000000001 | 178.264 |
| 0.7006944444444444 | 178.264 |
| 0.7013888888888888 | 173.709 |
| 0.7020833333333334 | 173.709 |
| 0.7027777777777778 | 169.156 |
| 0.7034722222222222 | 160.056 |
| 0.7041666666666666 | 155.509 |
| 0.7048611111111112 | 155.509 |
| 0.7055555555555556 | 155.509 |
| 0.7062499999999999 | 150.964 |
| 0.7069444444444444 | 146.423 |
| 0.7076388888888889 | 146.423 |
| 0.7083333333333334 | 137.347 |
| 0.7090277777777777 | 92.184 |
| 0.7097222222222223 | 96.682 |
| 0.7104166666666667 | 92.184 |
| 0.7111111111111111 | 87.692 |
| 0.7118055555555555 | 87.692 |
| 0.7125 | 132.814 |
| 0.7131944444444445 | 137.347 |
| 0.7138888888888889 | 137.347 |
| 0.7145833333333332 | 137.347 |
| 0.7152777777777778 | 137.347 |
| 0.7159722222222222 | 137.347 |
| 0.7166666666666667 | 137.347 |
| 0.717361111111111 | 137.347 |
| 0.7180555555555556 | 137.347 |
| 0.71875 | 132.814 |
| 0.7194444444444444 | 132.814 |
| 0.720138888888889 | 128.284 |
| 0.7208333333333333 | 128.284 |
| 0.7215277777777778 | 128.284 |
| 0.7222222222222222 | 128.284 |
| 0.7229166666666668 | 123.758 |
| 0.7236111111111111 | 123.758 |
| 0.7243055555555555 | 119.235 |
| 0.725 | 119.235 |
| 0.7256944444444445 | 119.235 |
| 0.7263888888888889 | 119.235 |
| 0.7270833333333333 | 114.716 |
| 0.7277777777777777 | 92.184 |
| 0.7284722222222223 | 83.205 |
| 0.7291666666666666 | 74.246 |
| 0.7298611111111111 | 92.184 |
| 0.7305555555555556 | 105.69 |
| 0.7312500000000001 | 105.69 |
| 0.7319444444444444 | 110.201 |
| 0.7326388888888888 | 105.69 |
| 0.7333333333333334 | 105.69 |
| 0.7340277777777778 | 105.69 |
| 0.7347222222222222 | 101.184 |
| 0.7354166666666666 | 83.205 |
| 0.7361111111111112 | 87.692 |
| 0.7368055555555556 | 101.184 |
| 0.7374999999999999 | 101.184 |
| 0.7381944444444444 | 101.184 |
| 0.7388888888888889 | 96.682 |
| 0.7395833333333334 | 96.682 |
| 0.7402777777777777 | 96.682 |
| 0.7409722222222223 | 96.682 |
| 0.7416666666666667 | 96.682 |
| 0.7423611111111111 | 96.682 |
| 0.7430555555555555 | 96.682 |
| 0.74375 | 96.682 |
| 0.7444444444444445 | 96.682 |
| 0.7451388888888889 | 96.682 |
| 0.7458333333333332 | 83.205 |
| 0.7465277777777778 | 92.184 |
| 0.7472222222222222 | 83.205 |
| 0.7479166666666667 | 74.246 |
| 0.748611111111111 | 74.246 |
| 0.7493055555555556 | 74.246 |
| 0.75 | 83.205 |
| 0.7506944444444444 | 74.246 |
| 0.751388888888889 | 74.246 |
| 0.7520833333333333 | 74.246 |
| 0.7527777777777778 | 69.775 |
| 0.7534722222222222 | 83.205 |
| 0.7541666666666668 | 87.692 |
| 0.7548611111111111 | 92.184 |
| 0.7555555555555555 | 92.184 |
| 0.75625 | 92.184 |
| 0.7569444444444445 | 87.692 |
| 0.7576388888888889 | 87.692 |
| 0.7583333333333333 | 83.205 |
| 0.7590277777777777 | 83.205 |
| 0.7597222222222223 | 78.722 |
| 0.7604166666666666 | 78.722 |
| 0.7611111111111111 | 78.722 |
| 0.7618055555555556 | 74.246 |
| 0.7625000000000001 | 74.246 |
| 0.7631944444444444 | 74.246 |
| 0.7638888888888888 | 74.246 |
| 0.7645833333333334 | 74.246 |
| 0.7652777777777778 | 69.775 |
| 0.7659722222222222 | 65.31 |
| 0.7666666666666666 | 65.31 |
| 0.7673611111111112 | 60.85 |
| 0.7680555555555556 | 60.85 |
| 0.7687499999999999 | 65.31 |
| 0.7694444444444444 | 65.31 |
| 0.7701388888888889 | 60.85 |
| 0.7708333333333334 | 60.85 |
| 0.7715277777777777 | 56.398 |
| 0.7722222222222223 | 56.398 |
| 0.7729166666666667 | 56.398 |
| 0.7736111111111111 | 56.398 |
| 0.7743055555555555 | 51.951 |
| 0.775 | 47.511 |
| 0.7756944444444445 | 47.511 |
| 0.7763888888888889 | 47.511 |
| 0.7770833333333332 | 47.511 |
| 0.7777777777777778 | 47.511 |
| 0.7784722222222222 | 51.951 |
| 0.7791666666666667 | 47.511 |
| 0.779861111111111 | 47.511 |
| 0.7805555555555556 | 47.511 |
| 0.78125 | 47.511 |
| 0.7819444444444444 | 43.079 |
| 0.782638888888889 | 43.079 |
| 0.7833333333333333 | 43.079 |
| 0.7840277777777778 | 43.079 |
| 0.7847222222222222 | 38.653 |
| 0.7854166666666668 | 38.653 |
| 0.7861111111111111 | 34.234 |
| 0.7868055555555555 | 34.234 |
| 0.7875 | 34.234 |
| 0.7881944444444445 | 29.823 |
| 0.7888888888888889 | 29.823 |
| 0.7895833333333333 | 25.419 |
| 0.7902777777777777 | 25.419 |
| 0.7909722222222223 | 21.024 |
| 0.7916666666666666 | 16.636 |
| 0.7923611111111111 | 16.636 |
| 0.7930555555555556 | 16.636 |
| 0.7937500000000001 | 12.257 |
| 0.7944444444444444 | 12.257 |
| 0.7951388888888888 | 12.257 |
| 0.7958333333333334 | 12.257 |
| 0.7965277777777778 | 12.257 |
| 0.7972222222222222 | 12.257 |
| 0.7979166666666666 | 12.257 |
| 0.7986111111111112 | 12.257 |
| 0.7993055555555556 | 7.887 |
| 0.7999999999999999 | 7.887 |
| 0.8006944444444444 | 7.887 |
| 0.8013888888888889 | 7.887 |
| 0.8020833333333334 | 7.887 |
| 0.8027777777777777 | 7.887 |
| 0.8034722222222223 | 7.887 |
| 0.8041666666666667 | 7.887 |
| 0.8048611111111111 | 7.887 |
| 0.8055555555555555 | 7.887 |
| 0.80625 | 7.887 |
| 0.8069444444444445 | 7.887 |
| 0.8076388888888889 | 3.525 |
| 0.8083333333333332 | 7.887 |
| 0.8090277777777778 | 7.887 |
| 0.8097222222222222 | 3.525 |
| 0.8104166666666667 | 3.525 |
| 0.811111111111111 | 3.525 |
| 0.8118055555555556 | 3.525 |
| 0.8125 | 3.525 |
| 0.8131944444444444 | 3.525 |
| 0.813888888888889 | 3.525 |
| 0.8145833333333333 | 3.525 |
| 0.8152777777777778 | 3.525 |
| 0.8159722222222222 | 3.525 |
| 0.8166666666666668 | 3.525 |
| 0.8173611111111111 | 3.525 |
| 0.8180555555555555 | 3.525 |
| 0.81875 | 3.525 |
| 0.8194444444444445 | 0 |
| 0.8201388888888889 | 0 |
| 0.8208333333333333 | 0 |
| 0.8215277777777777 | 0 |
| 0.8222222222222223 | 0 |
| 0.8229166666666666 | 0 |
| 0.8236111111111111 | 0 |
| 0.8243055555555556 | 0 |
| 0.8250000000000001 | 0 |
| 0.8256944444444444 | 0 |
| 0.8263888888888888 | 0 |
| 0.8270833333333334 | 0 |
| 0.8277777777777778 | 0 |
| 0.8284722222222222 | 0 |
| 0.8291666666666666 | 0 |
| 0.8298611111111112 | 0 |
| 0.8305555555555556 | 0 |
| 0.8312499999999999 | 0 |
| 0.8319444444444444 | 0 |
| 0.8326388888888889 | 0 |
| 0.8333333333333334 | 0 |
| 0.8340277777777777 | 0 |
| 0.8347222222222223 | 0 |
| 0.8354166666666667 | 0 |
| 0.8361111111111111 | 0 |
| 0.8368055555555555 | 0 |
| 0.8375 | 0 |
| 0.8381944444444445 | 0 |
| 0.8388888888888889 | 0 |
| 0.8395833333333332 | 0 |
| 0.8402777777777778 | 0 |
| 0.8409722222222222 | 0 |
| 0.8416666666666667 | 0 |
| 0.842361111111111 | 0 |
| 0.8430555555555556 | 0 |
| 0.84375 | 0 |
| 0.8444444444444444 | 0 |
| 0.845138888888889 | 0 |
| 0.8458333333333333 | 0 |
| 0.8465277777777778 | 0 |
| 0.8472222222222222 | 0 |
| 0.8479166666666668 | 0 |
| 0.8486111111111111 | 0 |
| 0.8493055555555555 | 0 |
| 0.85 | 0 |
| 0.8506944444444445 | 0 |
| 0.8513888888888889 | 0 |
| 0.8520833333333333 | 0 |
| 0.8527777777777777 | 0 |
| 0.8534722222222223 | 0 |
| 0.8541666666666666 | 0 |
| 0.8548611111111111 | 0 |
| 0.8555555555555556 | 0 |
| 0.8562500000000001 | 0 |
| 0.8569444444444444 | 0 |
| 0.8576388888888888 | 0 |
| 0.8583333333333334 | 0 |
| 0.8590277777777778 | 0 |
| 0.8597222222222222 | 0 |
| 0.8604166666666666 | 0 |
| 0.8611111111111112 | 0 |
| 0.8618055555555556 | 0 |
| 0.8624999999999999 | 0 |
| 0.8631944444444444 | 0 |
| 0.8638888888888889 | 0 |
| 0.8645833333333334 | 0 |
| 0.8652777777777777 | 0 |
| 0.8659722222222223 | 0 |
| 0.8666666666666667 | 0 |
| 0.8673611111111111 | 0 |
| 0.8680555555555555 | 0 |
| 0.86875 | 0 |
| 0.8694444444444445 | 0 |
| 0.8701388888888889 | 0 |
| 0.8708333333333332 | 0 |
| 0.8715277777777778 | 0 |
| 0.8722222222222222 | 0 |
| 0.8729166666666667 | 0 |
| 0.873611111111111 | 0 |
| 0.8743055555555556 | 0 |
| 0.875 | 0 |
| 0.8756944444444444 | 0 |
| 0.876388888888889 | 0 |
| 0.8770833333333333 | 0 |
| 0.8777777777777778 | 0 |
| 0.8784722222222222 | 0 |
| 0.8791666666666668 | 0 |
| 0.8798611111111111 | 0 |
| 0.8805555555555555 | 0 |
| 0.88125 | 0 |
| 0.8819444444444445 | 0 |
| 0.8826388888888889 | 0 |
| 0.8833333333333333 | 0 |
| 0.8840277777777777 | 0 |
| 0.8847222222222223 | 0 |
| 0.8854166666666666 | 0 |
| 0.8861111111111111 | 0 |
| 0.8868055555555556 | 0 |
| 0.8875000000000001 | 0 |
| 0.8881944444444444 | 0 |
| 0.8888888888888888 | 0 |
| 0.8895833333333334 | 0 |
| 0.8902777777777778 | 0 |
| 0.8909722222222222 | 0 |
| 0.8916666666666666 | 0 |
| 0.8923611111111112 | 0 |
| 0.8930555555555556 | 0 |
| 0.8937499999999999 | 0 |
| 0.8944444444444444 | 0 |
| 0.8951388888888889 | 0 |
| 0.8958333333333334 | 0 |
| 0.8965277777777777 | 0 |
| 0.8972222222222223 | 0 |
| 0.8979166666666667 | 0 |
| 0.8986111111111111 | 0 |
| 0.8993055555555555 | 0 |
| 0.9 | 0 |
| 0.9006944444444445 | 0 |
| 0.9013888888888889 | 0 |
| 0.9020833333333332 | 0 |
| 0.9027777777777778 | 0 |
| 0.9034722222222222 | 0 |
| 0.9041666666666667 | 0 |
| 0.904861111111111 | 0 |
| 0.9055555555555556 | 0 |
| 0.90625 | 0 |
| 0.9069444444444444 | 0 |
| 0.907638888888889 | 0 |
| 0.9083333333333333 | 0 |
| 0.9090277777777778 | 0 |
| 0.9097222222222222 | 0 |
| 0.9104166666666668 | 0 |
| 0.9111111111111111 | 0 |
| 0.9118055555555555 | 0 |
| 0.9125 | 0 |
| 0.9131944444444445 | 0 |
| 0.9138888888888889 | 0 |
| 0.9145833333333333 | 0 |
| 0.9152777777777777 | 0 |
| 0.9159722222222223 | 0 |
| 0.9166666666666666 | 0 |
| 0.9173611111111111 | 0 |
| 0.9180555555555556 | 0 |
| 0.9187500000000001 | 0 |
| 0.9194444444444444 | 0 |
| 0.9201388888888888 | 0 |
| 0.9208333333333334 | 0 |
| 0.9215277777777778 | 0 |
| 0.9222222222222222 | 0 |
| 0.9229166666666666 | 0 |
| 0.9236111111111112 | 0 |
| 0.9243055555555556 | 0 |
| 0.9249999999999999 | 0 |
| 0.9256944444444444 | 0 |
| 0.9263888888888889 | 0 |
| 0.9270833333333334 | 0 |
| 0.9277777777777777 | 0 |
| 0.9284722222222223 | 0 |
| 0.9291666666666667 | 0 |
| 0.9298611111111111 | 0 |
| 0.9305555555555555 | 0 |
| 0.93125 | 0 |
| 0.9319444444444445 | 0 |
| 0.9326388888888889 | 0 |
| 0.9333333333333332 | 0 |
| 0.9340277777777778 | 0 |
| 0.9347222222222222 | 0 |
| 0.9354166666666667 | 0 |
| 0.936111111111111 | 0 |
| 0.9368055555555556 | 0 |
| 0.9375 | 0 |
| 0.9381944444444444 | 0 |
| 0.938888888888889 | 0 |
| 0.9395833333333333 | 0 |
| 0.9402777777777778 | 0 |
| 0.9409722222222222 | 0 |
| 0.9416666666666668 | 0 |
| 0.9423611111111111 | 0 |
| 0.9430555555555555 | 0 |
| 0.94375 | 0 |
| 0.9444444444444445 | 0 |
| 0.9451388888888889 | 0 |
| 0.9458333333333333 | 0 |
| 0.9465277777777777 | 0 |
| 0.9472222222222223 | 0 |
| 0.9479166666666666 | 0 |
| 0.9486111111111111 | 0 |
| 0.9493055555555556 | 0 |
| 0.9500000000000001 | 0 |
| 0.9506944444444444 | 0 |
| 0.9513888888888888 | 0 |
| 0.9520833333333334 | 0 |
| 0.9527777777777778 | 0 |
| 0.9534722222222222 | 0 |
| 0.9541666666666666 | 0 |
| 0.9548611111111112 | 0 |
| 0.9555555555555556 | 0 |
| 0.9562499999999999 | 0 |
| 0.9569444444444444 | 0 |
| 0.9576388888888889 | 0 |
| 0.9583333333333334 | 0 |
| 0.9590277777777777 | 0 |
| 0.9597222222222223 | 0 |
| 0.9604166666666667 | 0 |
| 0.9611111111111111 | 0 |
| 0.9618055555555555 | 0 |
| 0.9625 | 0 |
| 0.9631944444444445 | 0 |
| 0.9638888888888889 | 0 |
| 0.9645833333333332 | 0 |
| 0.9652777777777778 | 0 |
| 0.9659722222222222 | 0 |
| 0.9666666666666667 | 0 |
| 0.967361111111111 | 0 |
| 0.9680555555555556 | 0 |
| 0.96875 | 0 |
| 0.9694444444444444 | 0 |
| 0.970138888888889 | 0 |
| 0.9708333333333333 | 0 |
| 0.9715277777777778 | 0 |
| 0.9722222222222222 | 0 |
| 0.9729166666666668 | 0 |
| 0.9736111111111111 | 0 |
| 0.9743055555555555 | 0 |
| 0.975 | 0 |
| 0.9756944444444445 | 0 |
| 0.9763888888888889 | 0 |
| 0.9770833333333333 | 0 |
| 0.9777777777777777 | 0 |
| 0.9784722222222223 | 0 |
| 0.9791666666666666 | 0 |
| 0.9798611111111111 | 0 |
| 0.9805555555555556 | 0 |
| 0.9812500000000001 | 0 |
| 0.9819444444444444 | 0 |
| 0.9826388888888888 | 0 |
| 0.9833333333333334 | 0 |
| 0.9840277777777778 | 0 |
| 0.9847222222222222 | 0 |
| 0.9854166666666666 | 0 |
| 0.9861111111111112 | 0 |
| 0.9868055555555556 | 0 |
| 0.9874999999999999 | 0 |
| 0.9881944444444444 | 0 |
| 0.9888888888888889 | 0 |
| 0.9895833333333334 | 0 |
| 0.9902777777777777 | 0 |
| 0.9909722222222223 | 0 |
| 0.9916666666666667 | 0 |
| 0.9923611111111111 | 0 |
| 0.9930555555555555 | 0 |
| 0.99375 | 0 |
| 0.9944444444444445 | 0 |
| 0.9951388888888889 | 0 |
| 0.9958333333333332 | 0 |
| 0.9965277777777778 | 0 |
| 0.9972222222222222 | 0 |
| 0.9979166666666667 | 0 |
| 0.998611111111111 | 0 |
| 0.9993055555555556 | 0 |